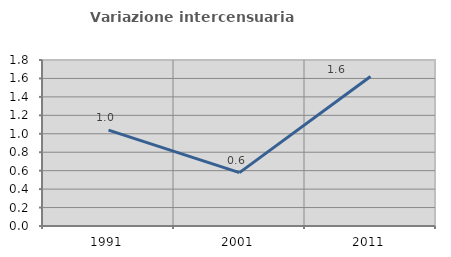
| Category | Variazione intercensuaria annua |
|---|---|
| 1991.0 | 1.04 |
| 2001.0 | 0.578 |
| 2011.0 | 1.62 |